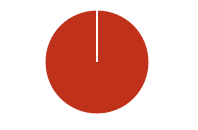
| Category | Total |
|---|---|
| Y | 0 |
| R | 0 |
| T | 0 |
| M | 0 |
| F | 0 |
| N | 267 |